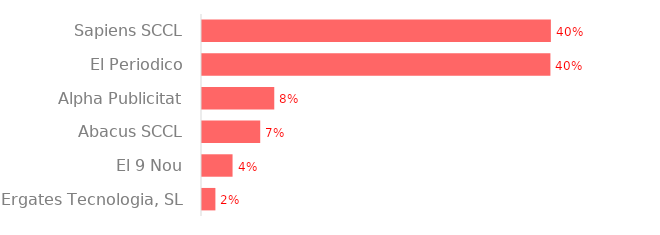
| Category | Series 0 |
|---|---|
| Sapiens SCCL | 7875.34 |
| El Periodico | 7864.98 |
| Alpha Publicitat | 1631.33 |
| Abacus SCCL | 1314.06 |
| El 9 Nou | 689.7 |
| Ergates Tecnologia, SL | 302.5 |